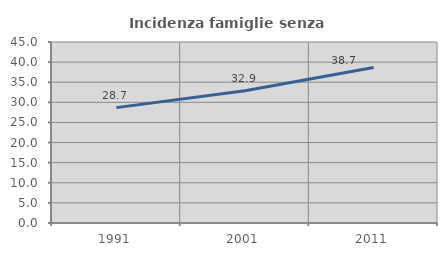
| Category | Incidenza famiglie senza nuclei |
|---|---|
| 1991.0 | 28.682 |
| 2001.0 | 32.896 |
| 2011.0 | 38.655 |